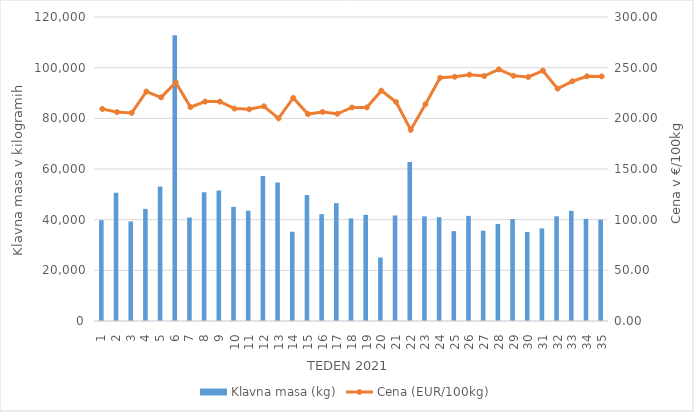
| Category | Klavna masa (kg) |
|---|---|
| 1.0 | 39814 |
| 2.0 | 50603 |
| 3.0 | 39295 |
| 4.0 | 44250 |
| 5.0 | 53061 |
| 6.0 | 112816 |
| 7.0 | 40829 |
| 8.0 | 50775 |
| 9.0 | 51535 |
| 10.0 | 45040 |
| 11.0 | 43536 |
| 12.0 | 57246 |
| 13.0 | 54680 |
| 14.0 | 35237 |
| 15.0 | 49721 |
| 16.0 | 42177 |
| 17.0 | 46525 |
| 18.0 | 40491 |
| 19.0 | 41888 |
| 20.0 | 25048 |
| 21.0 | 41651 |
| 22.0 | 62774 |
| 23.0 | 41297 |
| 24.0 | 40971 |
| 25.0 | 35465 |
| 26.0 | 41489 |
| 27.0 | 35675 |
| 28.0 | 38316 |
| 29.0 | 40265 |
| 30.0 | 35146 |
| 31.0 | 36548 |
| 32.0 | 41314 |
| 33.0 | 43471 |
| 34.0 | 40333 |
| 35.0 | 40041 |